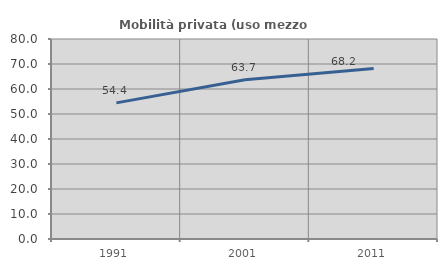
| Category | Mobilità privata (uso mezzo privato) |
|---|---|
| 1991.0 | 54.442 |
| 2001.0 | 63.679 |
| 2011.0 | 68.173 |